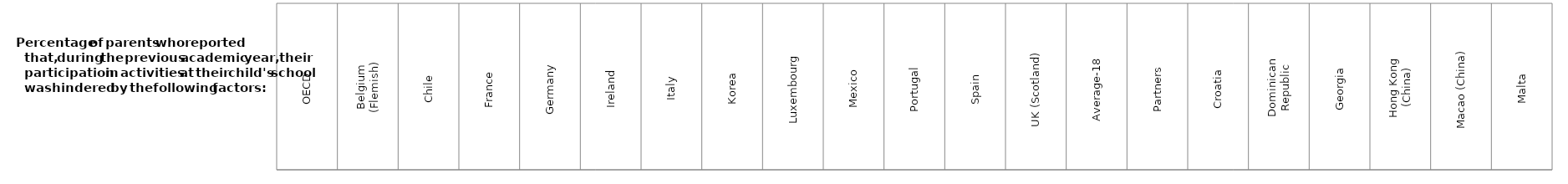
| Category | Series 0 |
|---|---|
| OECD | 1 |
| Belgium (Flemish) | 1 |
| Chile | 1 |
| France | 1 |
| Germany | 1 |
| Ireland | 1 |
| Italy | 1 |
| Korea | 1 |
| Luxembourg | 1 |
| Mexico | 1 |
| Portugal | 1 |
| Spain | 1 |
| UK (Scotland) | 1 |
| Average-18 | 1 |
| Partners | 1 |
| Croatia | 1 |
| Dominican Republic | 1 |
| Georgia | 1 |
| Hong Kong (China) | 1 |
| Macao (China) | 1 |
| Malta | 1 |